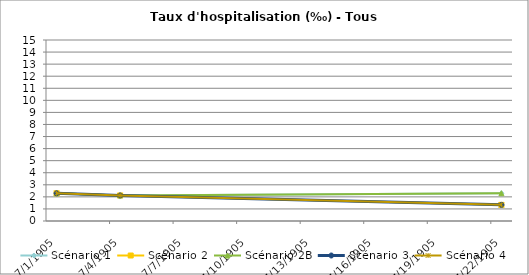
| Category | Scénario 1 | Scénario 2 | Scénario 2B | Scénario 3 | Scénario 4 |
|---|---|---|---|---|---|
| 2009.0 | 2.296 | 2.296 | 2.296 | 2.296 | 2.296 |
| 2012.0 | 2.118 | 2.118 | 2.118 | 2.118 | 2.118 |
| 2030.0 | 2.301 | 1.338 | 2.301 | 1.338 | 1.338 |